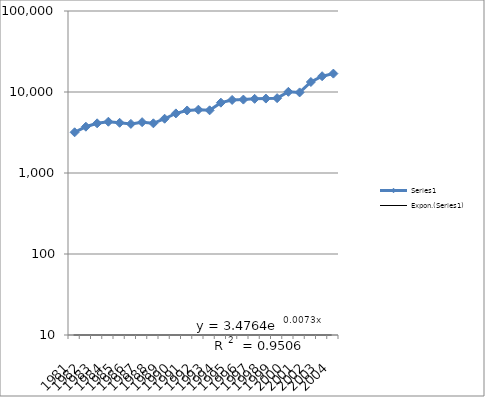
| Category | Series 0 |
|---|---|
| 1981 | 3182 |
| 1982 | 3729 |
| 1983 | 4105 |
| 1984 | 4296 |
| 1985 | 4166 |
| 1986 | 4040 |
| 1987 | 4243 |
| 1988 | 4106 |
| 1989 | 4677 |
| 1990 | 5443 |
| 1991 | 5914 |
| 1992 | 6047 |
| 1993 | 5937 |
| 1994 | 7389 |
| 1995 | 7977.658 |
| 1996 | 8060.776 |
| 1997 | 8235.077 |
| 1998 | 8297.341 |
| 1999 | 8398.08 |
| 2000 | 10052.362 |
| 2001 | 9883.154 |
| 2002 | 13292.852 |
| 2003 | 15655.896 |
| 2004 | 16863.25 |